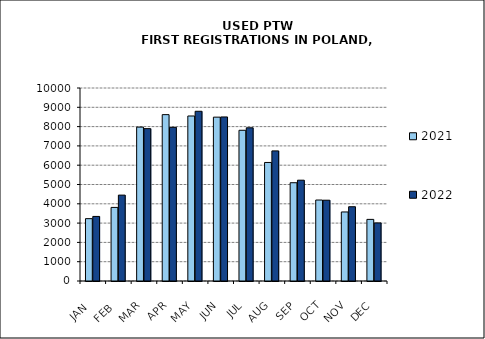
| Category | 2021 | 2022 |
|---|---|---|
|  JAN  | 3231 | 3346 |
|  FEB  | 3813 | 4450 |
| MAR | 7974 | 7895 |
| APR | 8620 | 7963 |
| MAY | 8550 | 8794 |
| JUN | 8490 | 8500 |
| JUL | 7810 | 7938 |
| AUG | 6142 | 6742 |
| SEP | 5092 | 5223 |
| OCT | 4196 | 4186 |
| NOV | 3577 | 3848 |
| DEC | 3193 | 3010 |